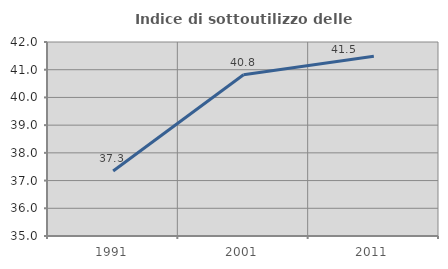
| Category | Indice di sottoutilizzo delle abitazioni  |
|---|---|
| 1991.0 | 37.345 |
| 2001.0 | 40.817 |
| 2011.0 | 41.484 |